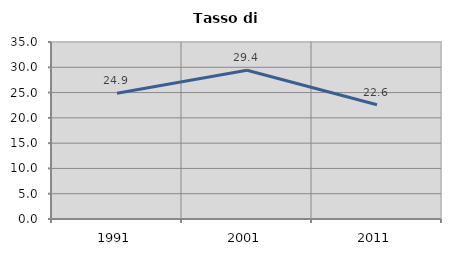
| Category | Tasso di disoccupazione   |
|---|---|
| 1991.0 | 24.868 |
| 2001.0 | 29.412 |
| 2011.0 | 22.599 |